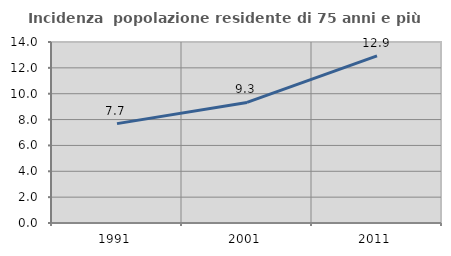
| Category | Incidenza  popolazione residente di 75 anni e più |
|---|---|
| 1991.0 | 7.688 |
| 2001.0 | 9.325 |
| 2011.0 | 12.928 |